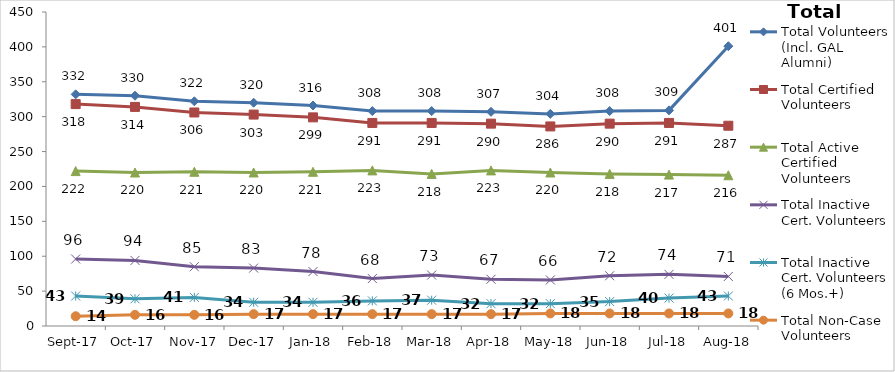
| Category | Total Volunteers (Incl. GAL Alumni) | Total Certified Volunteers | Total Active Certified Volunteers | Total Inactive Cert. Volunteers | Total Inactive Cert. Volunteers (6 Mos.+) | Total Non-Case Volunteers |
|---|---|---|---|---|---|---|
| 2017-09-01 | 332 | 318 | 222 | 96 | 43 | 14 |
| 2017-10-01 | 330 | 314 | 220 | 94 | 39 | 16 |
| 2017-11-01 | 322 | 306 | 221 | 85 | 41 | 16 |
| 2017-12-01 | 320 | 303 | 220 | 83 | 34 | 17 |
| 2018-01-01 | 316 | 299 | 221 | 78 | 34 | 17 |
| 2018-02-01 | 308 | 291 | 223 | 68 | 36 | 17 |
| 2018-03-01 | 308 | 291 | 218 | 73 | 37 | 17 |
| 2018-04-01 | 307 | 290 | 223 | 67 | 32 | 17 |
| 2018-05-01 | 304 | 286 | 220 | 66 | 32 | 18 |
| 2018-06-01 | 308 | 290 | 218 | 72 | 35 | 18 |
| 2018-07-01 | 309 | 291 | 217 | 74 | 40 | 18 |
| 2018-08-01 | 401 | 287 | 216 | 71 | 43 | 18 |